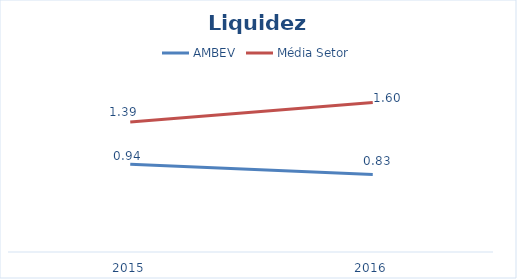
| Category | AMBEV | Média Setor |
|---|---|---|
| 2015.0 | 0.939 | 1.394 |
| 2016.0 | 0.83 | 1.601 |